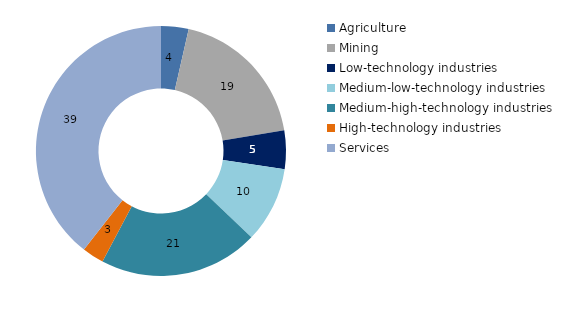
| Category | 2014 |
|---|---|
| Agriculture | 3.561 |
| Mining | 18.778 |
| Low-technology industries | 4.988 |
| Medium-low-technology industries | 9.809 |
| Medium-high-technology industries | 20.617 |
| High-technology industries | 2.816 |
| Services | 39.432 |